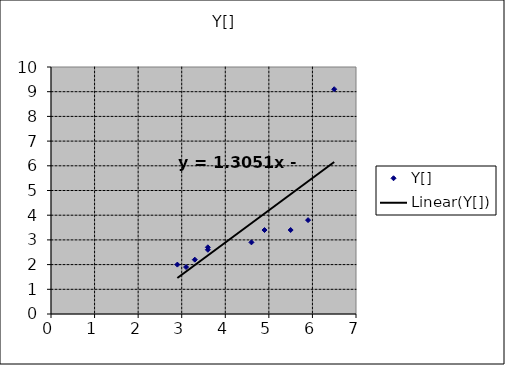
| Category | Y[] |
|---|---|
| 5.5 | 3.4 |
| 5.9 | 3.8 |
| 6.5 | 9.1 |
| 3.3 | 2.2 |
| 3.6 | 2.6 |
| 4.6 | 2.9 |
| 2.9 | 2 |
| 3.6 | 2.7 |
| 3.1 | 1.9 |
| 4.9 | 3.4 |